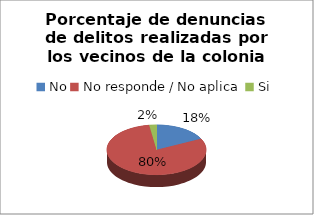
| Category | Series 0 |
|---|---|
| No | 0.176 |
| No responde / No aplica | 0.8 |
| Si | 0.024 |